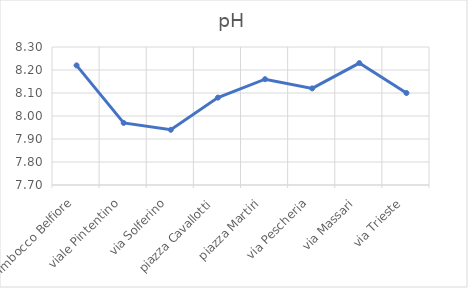
| Category |  pH |
|---|---|
| Imbocco Belfiore | 8.22 |
| viale Pintentino | 7.97 |
| via Solferino | 7.94 |
| piazza Cavallotti | 8.08 |
| piazza Martiri | 8.16 |
| via Pescheria | 8.12 |
| via Massari | 8.23 |
| via Trieste | 8.1 |